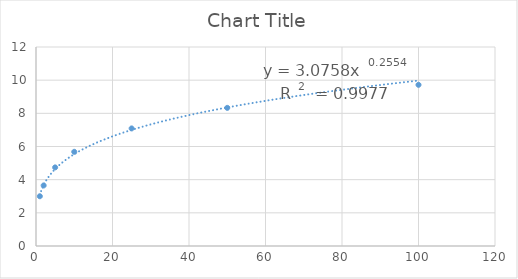
| Category | Series 0 |
|---|---|
| 1.0 | 3 |
| 2.0 | 3.65 |
| 5.0 | 4.74 |
| 10.0 | 5.68 |
| 25.0 | 7.09 |
| 50.0 | 8.33 |
| 100.0 | 9.72 |